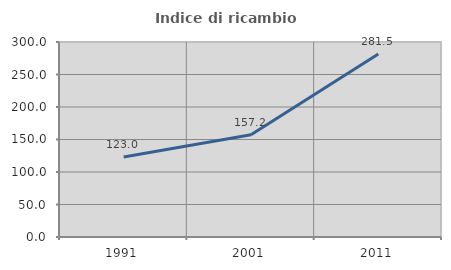
| Category | Indice di ricambio occupazionale  |
|---|---|
| 1991.0 | 122.961 |
| 2001.0 | 157.221 |
| 2011.0 | 281.495 |